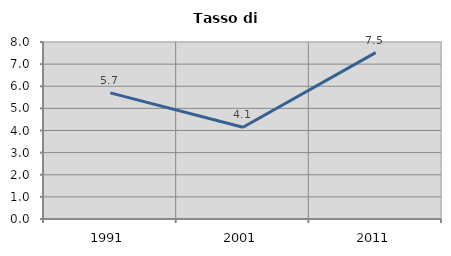
| Category | Tasso di disoccupazione   |
|---|---|
| 1991.0 | 5.702 |
| 2001.0 | 4.149 |
| 2011.0 | 7.522 |